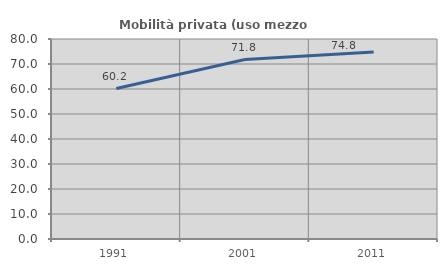
| Category | Mobilità privata (uso mezzo privato) |
|---|---|
| 1991.0 | 60.18 |
| 2001.0 | 71.799 |
| 2011.0 | 74.783 |